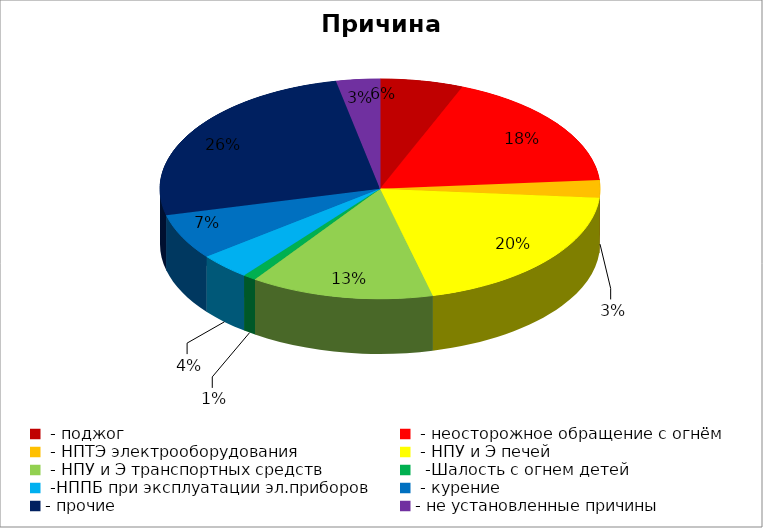
| Category | Причина пожара |
|---|---|
|  - поджог | 19 |
|  - неосторожное обращение с огнём | 55 |
|  - НПТЭ электрооборудования | 8 |
|  - НПУ и Э печей | 62 |
|  - НПУ и Э транспортных средств | 42 |
|   -Шалость с огнем детей | 3 |
|  -НППБ при эксплуатации эл.приборов | 12 |
|  - курение | 21 |
| - прочие | 80 |
| - не установленные причины | 10 |